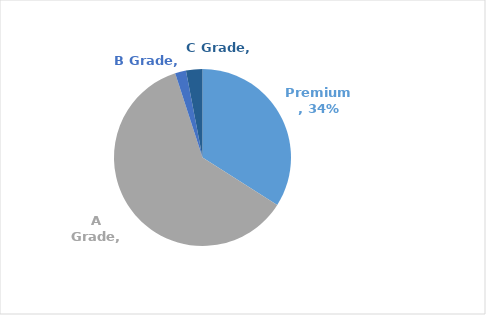
| Category | Series 0 |
|---|---|
| Premium | 0.34 |
| A Grade | 0.61 |
| B Grade | 0.02 |
| C Grade | 0.03 |